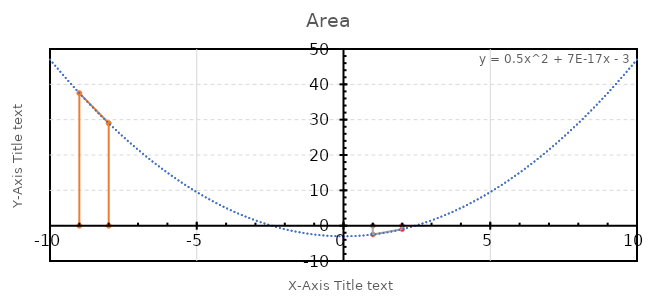
| Category | Y=0.5X^2-3 |
|---|---|
| -10.0 | 47 |
| -9.0 | 37.5 |
| -8.0 | 29 |
| -7.0 | 21.5 |
| -6.0 | 15 |
| -5.0 | 9.5 |
| -4.0 | 5 |
| -3.0 | 1.5 |
| -2.0 | -1 |
| -1.0 | -2.5 |
| 0.0 | -3 |
| 1.0 | -2.5 |
| 2.0 | -1 |
| 3.0 | 1.5 |
| 4.0 | 5 |
| 5.0 | 9.5 |
| 6.0 | 15 |
| 7.0 | 21.5 |
| 8.0 | 29 |
| 9.0 | 37.5 |
| 10.0 | 47 |